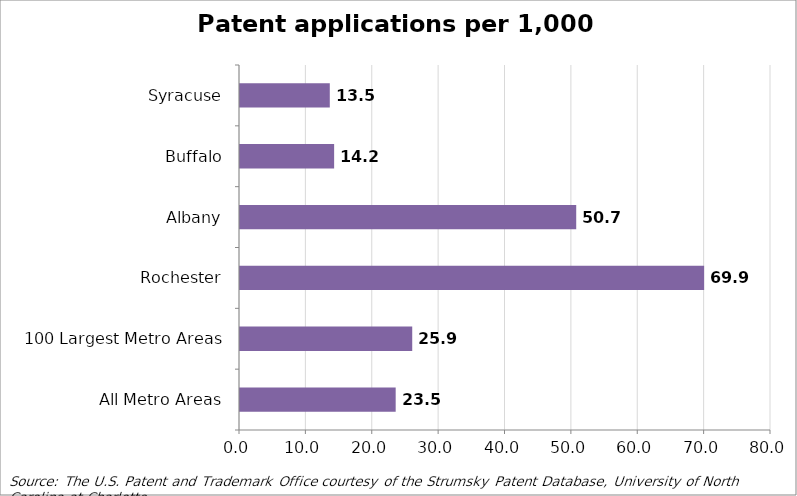
| Category | Patent applications per 1,000 workers |
|---|---|
| All Metro Areas | 23.455 |
| 100 Largest Metro Areas | 25.948 |
| Rochester | 69.925 |
| Albany | 50.654 |
| Buffalo | 14.182 |
| Syracuse | 13.529 |